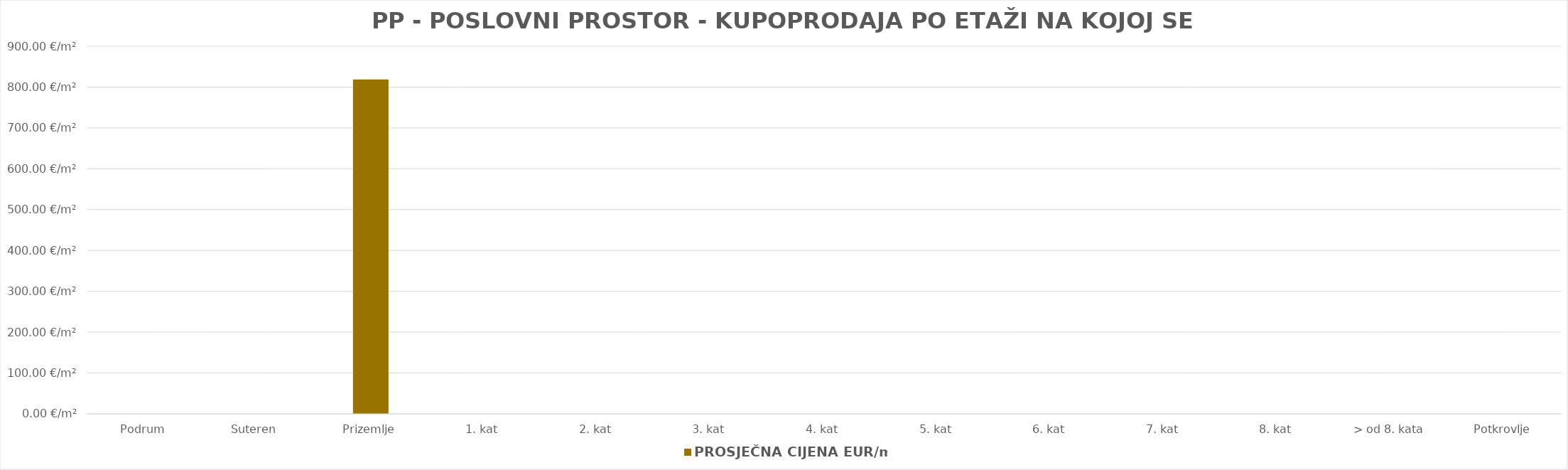
| Category | PROSJEČNA CIJENA EUR/m2 |
|---|---|
| Podrum | 0 |
| Suteren  | 0 |
| Prizemlje | 1902-03-28 18:49:01 |
| 1. kat | 0 |
| 2. kat | 0 |
| 3. kat | 0 |
| 4. kat | 0 |
| 5. kat | 0 |
| 6. kat | 0 |
| 7. kat | 0 |
| 8. kat | 0 |
| > od 8. kata | 0 |
| Potkrovlje | 0 |